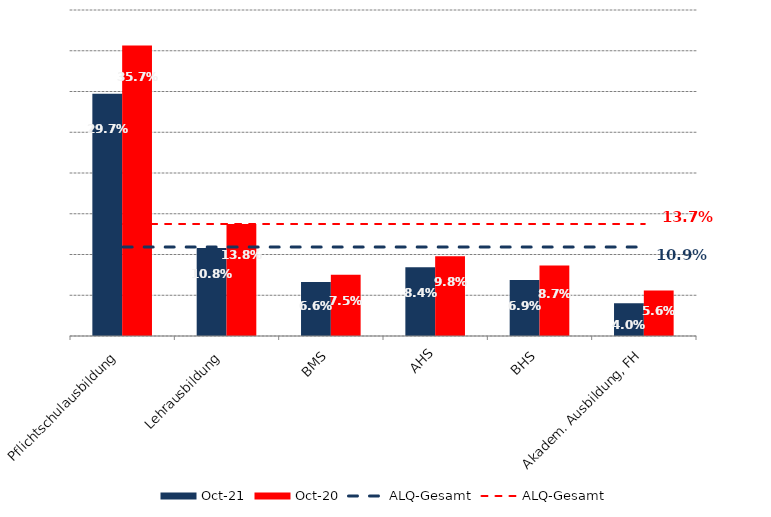
| Category | Okt 21 | Okt 20 |
|---|---|---|
| Pflichtschulausbildung | 0.297 | 0.357 |
| Lehrausbildung | 0.108 | 0.138 |
| BMS | 0.066 | 0.075 |
| AHS | 0.084 | 0.098 |
| BHS | 0.069 | 0.087 |
| Akadem. Ausbildung, FH | 0.04 | 0.056 |